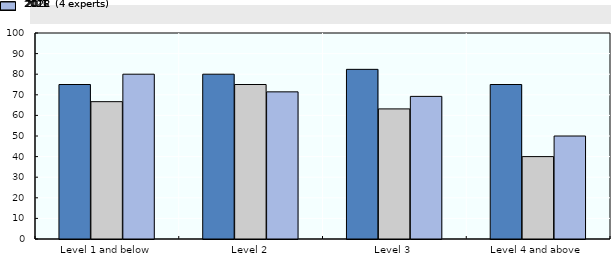
| Category | 2016 | 2021 | 2022 (4 experts) |
|---|---|---|---|
| Level 1 and below | 75 | 66.667 | 80 |
| Level 2 | 80 | 75 | 71.429 |
| Level 3 | 82.353 | 63.158 | 69.231 |
| Level 4 and above | 75 | 40 | 50 |